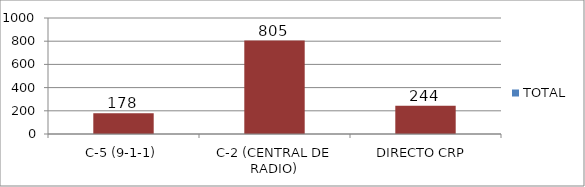
| Category | TOTAL |
|---|---|
| C-5 (9-1-1) | 178 |
| C-2 (CENTRAL DE RADIO) | 805 |
| DIRECTO CRP  | 244 |